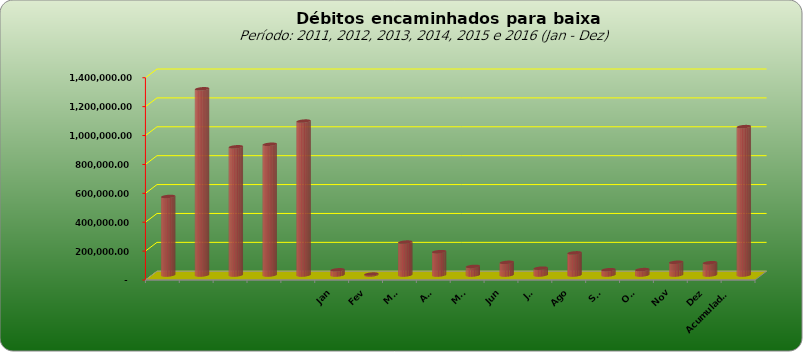
| Category |  543.796,20  |
|---|---|
|  | 543796.2 |
|  | 1289053.69 |
|  | 887573.08 |
|  | 905052.31 |
|  | 1065434.28 |
| Jan | 35964.03 |
| Fev | 6417.54 |
| Mar | 227804.72 |
| Abr | 161576.79 |
| Mai | 59557.82 |
| Jun | 87752.76 |
| Jul | 47447.42 |
| Ago | 153259.03 |
| Set | 36638.73 |
| Out | 37444.99 |
| Nov | 88269.58 |
| Dez | 85076 |
| Acumulado
2016 | 1027209.41 |